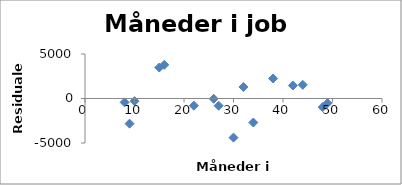
| Category | Series 0 |
|---|---|
| 8.0 | -431.114 |
| 9.0 | -2829.499 |
| 10.0 | -299.301 |
| 15.0 | 3480.423 |
| 16.0 | 3782.115 |
| 22.0 | -807.508 |
| 27.0 | -812.849 |
| 26.0 | -28.945 |
| 30.0 | -4393.066 |
| 34.0 | -2699.871 |
| 32.0 | 1296.367 |
| 38.0 | 2250.641 |
| 42.0 | 1458.469 |
| 44.0 | 1533.876 |
| 48.0 | -972.322 |
| 49.0 | -527.416 |